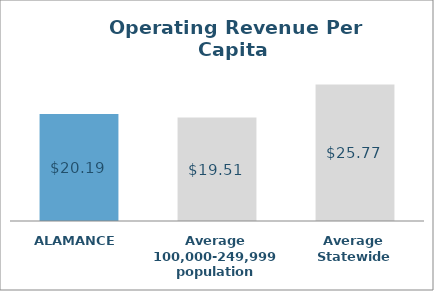
| Category | Series 0 |
|---|---|
| ALAMANCE | 20.192 |
| Average 100,000-249,999 population | 19.512 |
| Average Statewide | 25.769 |